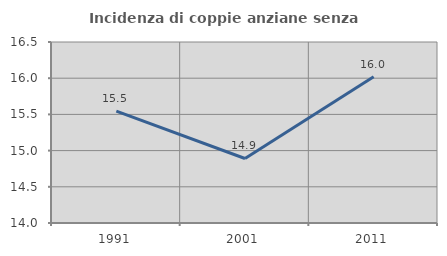
| Category | Incidenza di coppie anziane senza figli  |
|---|---|
| 1991.0 | 15.545 |
| 2001.0 | 14.891 |
| 2011.0 | 16.022 |